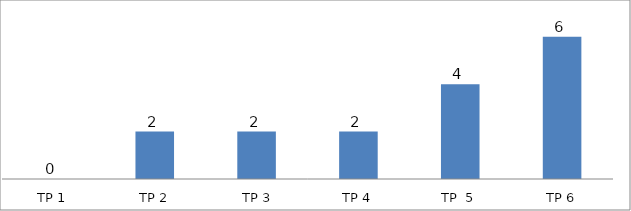
| Category | BIL. MURID |
|---|---|
| TP 1 | 0 |
| TP 2 | 2 |
|  TP 3 | 2 |
| TP 4 | 2 |
| TP  5 | 4 |
| TP 6 | 6 |